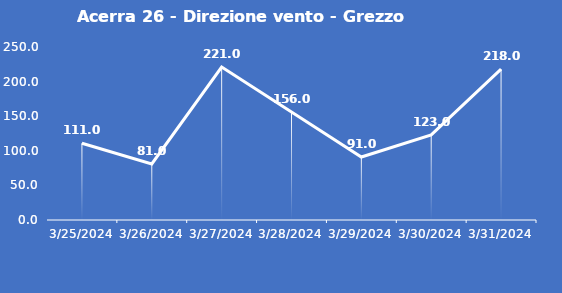
| Category | Acerra 26 - Direzione vento - Grezzo (°N) |
|---|---|
| 3/25/24 | 111 |
| 3/26/24 | 81 |
| 3/27/24 | 221 |
| 3/28/24 | 156 |
| 3/29/24 | 91 |
| 3/30/24 | 123 |
| 3/31/24 | 218 |